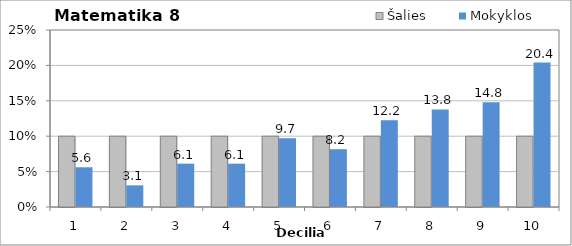
| Category | Šalies | Mokyklos |
|---|---|---|
| 1.0 | 10 | 5.612 |
| 2.0 | 10 | 3.061 |
| 3.0 | 10 | 6.122 |
| 4.0 | 10 | 6.122 |
| 5.0 | 10 | 9.694 |
| 6.0 | 10 | 8.163 |
| 7.0 | 10 | 12.245 |
| 8.0 | 10 | 13.776 |
| 9.0 | 10 | 14.796 |
| 10.0 | 10 | 20.408 |